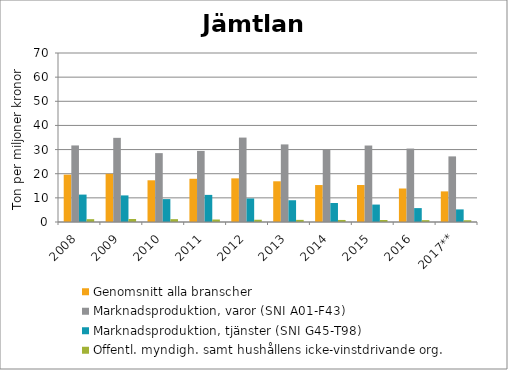
| Category | Genomsnitt alla branscher | Marknadsproduktion, varor (SNI A01-F43) | Marknadsproduktion, tjänster (SNI G45-T98) | Offentl. myndigh. samt hushållens icke-vinstdrivande org. |
|---|---|---|---|---|
| 2008 | 19.616 | 31.711 | 11.353 | 1.173 |
| 2009 | 19.96 | 34.861 | 11.012 | 1.238 |
| 2010 | 17.276 | 28.527 | 9.488 | 1.179 |
| 2011 | 17.903 | 29.44 | 11.23 | 1.034 |
| 2012 | 18.076 | 34.967 | 9.752 | 0.935 |
| 2013 | 16.862 | 32.137 | 9.012 | 0.88 |
| 2014 | 15.308 | 29.866 | 7.861 | 0.848 |
| 2015 | 15.318 | 31.674 | 7.22 | 0.834 |
| 2016 | 13.873 | 30.415 | 5.758 | 0.764 |
| 2017** | 12.683 | 27.174 | 5.222 | 0.732 |